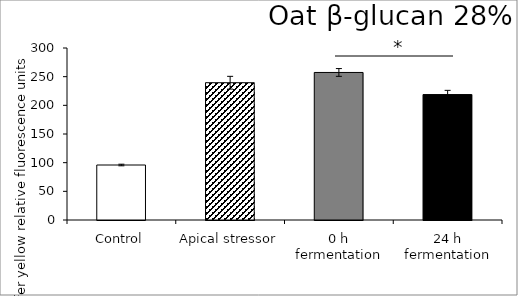
| Category | average |
|---|---|
| Control | 95.929 |
| Apical stressor | 239.449 |
| 0 h fermentation | 257.337 |
| 24 h fermentation | 218.773 |